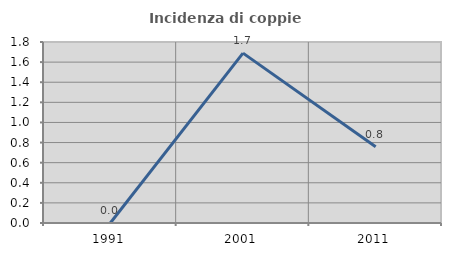
| Category | Incidenza di coppie miste |
|---|---|
| 1991.0 | 0 |
| 2001.0 | 1.689 |
| 2011.0 | 0.758 |